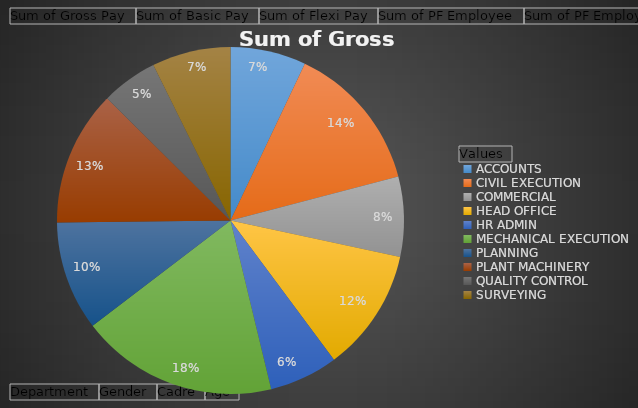
| Category | Sum of Gross Pay | Sum of Basic Pay | Sum of Flexi Pay | Sum of PF Employee | Sum of PF Employer | Sum of Net Pay | Sum of CTC |
|---|---|---|---|---|---|---|---|
| ACCOUNTS | 188330 | 75332 | 112998 | 9039 | 9039 | 179291 | 206408 |
| CIVIL EXECUTION | 370280 | 148112 | 222168 | 17774 | 17774 | 352506 | 405828 |
| COMMERCIAL | 199670 | 79868 | 119802 | 9584 | 9584 | 190086 | 218838 |
| HEAD OFFICE | 305910 | 122364 | 183546 | 14684 | 14684 | 291226 | 335278 |
| HR ADMIN | 171020 | 68408 | 102612 | 8209 | 8209 | 162811 | 187438 |
| MECHANICAL EXECUTION | 491200 | 196480 | 294720 | 23577 | 23577 | 467623 | 538354 |
| PLANNING | 272410 | 108964 | 163446 | 13075 | 13075 | 259335 | 298560 |
| PLANT MACHINERY | 336920 | 134768 | 202152 | 16172 | 16172 | 320748 | 369264 |
| QUALITY CONTROL | 139940 | 55976 | 83964 | 6716 | 6716 | 133224 | 153372 |
| SURVEYING | 196040 | 78416 | 117624 | 9409 | 9409 | 186631 | 214858 |